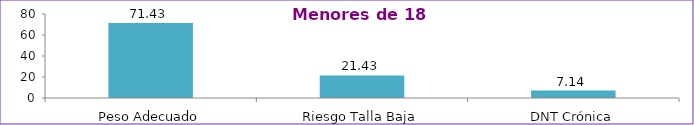
| Category | Series 0 |
|---|---|
| Peso Adecuado | 71.43 |
| Riesgo Talla Baja | 21.43 |
| DNT Crónica | 7.14 |